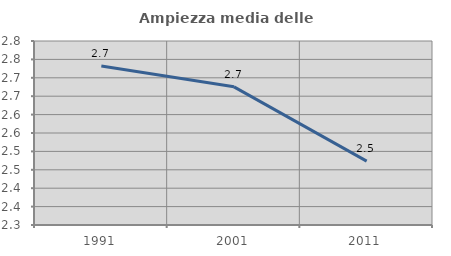
| Category | Ampiezza media delle famiglie |
|---|---|
| 1991.0 | 2.732 |
| 2001.0 | 2.675 |
| 2011.0 | 2.473 |